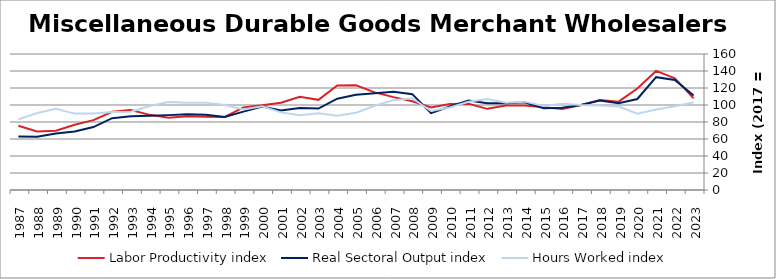
| Category | Labor Productivity index | Real Sectoral Output index | Hours Worked index |
|---|---|---|---|
| 2023.0 | 107.758 | 111.095 | 103.096 |
| 2022.0 | 131.415 | 129.355 | 98.432 |
| 2021.0 | 140.096 | 132.732 | 94.744 |
| 2020.0 | 119.308 | 107.05 | 89.726 |
| 2019.0 | 103.9 | 102.014 | 98.185 |
| 2018.0 | 105.901 | 105.14 | 99.281 |
| 2017.0 | 100 | 100 | 100 |
| 2016.0 | 95.336 | 96.681 | 101.411 |
| 2015.0 | 97.486 | 96.297 | 98.781 |
| 2014.0 | 99.306 | 103.223 | 103.944 |
| 2013.0 | 99.539 | 102.121 | 102.594 |
| 2012.0 | 95.479 | 102.19 | 107.029 |
| 2011.0 | 101.551 | 105.325 | 103.716 |
| 2010.0 | 101.189 | 98.189 | 97.035 |
| 2009.0 | 97.219 | 90.371 | 92.956 |
| 2008.0 | 104.362 | 112.742 | 108.031 |
| 2007.0 | 109.283 | 115.516 | 105.703 |
| 2006.0 | 114.832 | 113.798 | 99.099 |
| 2005.0 | 123.115 | 111.963 | 90.941 |
| 2004.0 | 123.01 | 107.401 | 87.311 |
| 2003.0 | 106.078 | 95.819 | 90.329 |
| 2002.0 | 109.585 | 96.509 | 88.068 |
| 2001.0 | 102.574 | 93.656 | 91.306 |
| 2000.0 | 99.715 | 98.144 | 98.424 |
| 1999.0 | 97.197 | 92.195 | 94.854 |
| 1998.0 | 85.905 | 85.898 | 99.991 |
| 1997.0 | 86.2 | 88.607 | 102.792 |
| 1996.0 | 86.801 | 89.133 | 102.686 |
| 1995.0 | 85.055 | 88.089 | 103.567 |
| 1994.0 | 88.412 | 87.412 | 98.869 |
| 1993.0 | 94.057 | 86.699 | 92.177 |
| 1992.0 | 92.071 | 84.526 | 91.805 |
| 1991.0 | 82.155 | 74.01 | 90.086 |
| 1990.0 | 76.7 | 68.935 | 89.876 |
| 1989.0 | 69.622 | 66.522 | 95.546 |
| 1988.0 | 68.961 | 62.521 | 90.662 |
| 1987.0 | 75.655 | 62.897 | 83.136 |